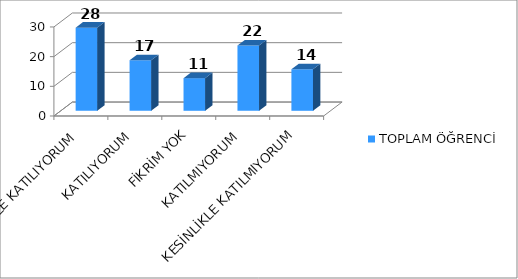
| Category | TOPLAM ÖĞRENCİ |
|---|---|
| KESİNLİKLE KATILIYORUM | 28 |
| KATILIYORUM | 17 |
| FİKRİM YOK | 11 |
| KATILMIYORUM | 22 |
| KESİNLİKLE KATILMIYORUM | 14 |